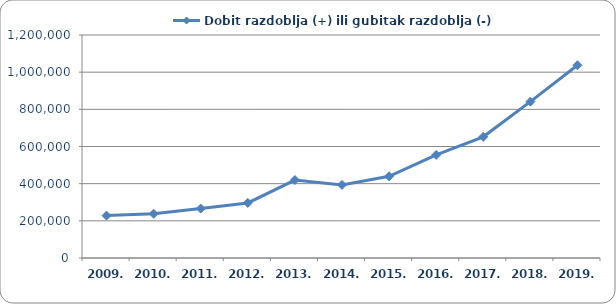
| Category | Dobit razdoblja (+) ili gubitak razdoblja (-)  |
|---|---|
| 2009. | 228072.006 |
| 2010. | 238355.117 |
| 2011. | 266097.543 |
| 2012. | 296409.288 |
| 2013. | 419487.616 |
| 2014. | 393230.535 |
| 2015. | 439566.494 |
| 2016. | 554743.968 |
| 2017. | 652137.742 |
| 2018. | 841376.518 |
| 2019. | 1037090.851 |